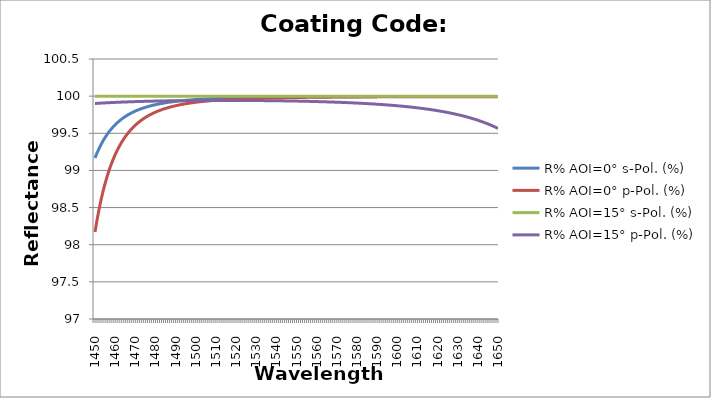
| Category | R% AOI=0° s-Pol. (%) | R% AOI=0° p-Pol. (%) | R% AOI=15° s-Pol. (%) | R% AOI=15° p-Pol. (%) |
|---|---|---|---|---|
| 1450.0 | 99.167 | 98.17 | 99.999 | 99.901 |
| 1451.0 | 99.234 | 98.332 | 99.999 | 99.903 |
| 1452.0 | 99.294 | 98.475 | 99.999 | 99.904 |
| 1453.0 | 99.349 | 98.604 | 99.999 | 99.906 |
| 1454.0 | 99.398 | 98.72 | 99.999 | 99.908 |
| 1455.0 | 99.443 | 98.824 | 99.999 | 99.909 |
| 1456.0 | 99.484 | 98.918 | 99.999 | 99.911 |
| 1457.0 | 99.521 | 99.003 | 99.999 | 99.912 |
| 1458.0 | 99.555 | 99.079 | 99.999 | 99.913 |
| 1459.0 | 99.586 | 99.149 | 99.999 | 99.915 |
| 1460.0 | 99.614 | 99.212 | 99.999 | 99.916 |
| 1461.0 | 99.64 | 99.27 | 99.999 | 99.917 |
| 1462.0 | 99.664 | 99.322 | 99.999 | 99.918 |
| 1463.0 | 99.686 | 99.37 | 99.999 | 99.92 |
| 1464.0 | 99.707 | 99.413 | 99.999 | 99.921 |
| 1465.0 | 99.725 | 99.453 | 99.999 | 99.922 |
| 1466.0 | 99.742 | 99.49 | 99.999 | 99.923 |
| 1467.0 | 99.758 | 99.523 | 99.999 | 99.924 |
| 1468.0 | 99.773 | 99.554 | 99.999 | 99.924 |
| 1469.0 | 99.786 | 99.583 | 99.999 | 99.925 |
| 1470.0 | 99.799 | 99.609 | 99.999 | 99.926 |
| 1471.0 | 99.811 | 99.633 | 99.999 | 99.927 |
| 1472.0 | 99.822 | 99.656 | 99.999 | 99.928 |
| 1473.0 | 99.832 | 99.676 | 99.999 | 99.929 |
| 1474.0 | 99.841 | 99.695 | 99.999 | 99.93 |
| 1475.0 | 99.85 | 99.713 | 99.999 | 99.93 |
| 1476.0 | 99.858 | 99.729 | 99.999 | 99.931 |
| 1477.0 | 99.865 | 99.745 | 99.999 | 99.932 |
| 1478.0 | 99.872 | 99.759 | 99.999 | 99.932 |
| 1479.0 | 99.879 | 99.772 | 99.999 | 99.933 |
| 1480.0 | 99.885 | 99.784 | 99.999 | 99.933 |
| 1481.0 | 99.891 | 99.796 | 99.999 | 99.934 |
| 1482.0 | 99.896 | 99.807 | 99.999 | 99.934 |
| 1483.0 | 99.901 | 99.817 | 99.999 | 99.935 |
| 1484.0 | 99.906 | 99.826 | 99.999 | 99.936 |
| 1485.0 | 99.911 | 99.835 | 99.999 | 99.936 |
| 1486.0 | 99.915 | 99.843 | 99.999 | 99.936 |
| 1487.0 | 99.919 | 99.851 | 99.999 | 99.937 |
| 1488.0 | 99.923 | 99.858 | 99.999 | 99.937 |
| 1489.0 | 99.926 | 99.865 | 99.999 | 99.938 |
| 1490.0 | 99.929 | 99.871 | 99.999 | 99.938 |
| 1491.0 | 99.932 | 99.877 | 99.999 | 99.938 |
| 1492.0 | 99.935 | 99.883 | 99.999 | 99.939 |
| 1493.0 | 99.938 | 99.888 | 99.999 | 99.939 |
| 1494.0 | 99.941 | 99.893 | 99.999 | 99.94 |
| 1495.0 | 99.943 | 99.898 | 99.999 | 99.94 |
| 1496.0 | 99.946 | 99.902 | 99.999 | 99.94 |
| 1497.0 | 99.948 | 99.906 | 99.999 | 99.94 |
| 1498.0 | 99.95 | 99.91 | 99.999 | 99.94 |
| 1499.0 | 99.952 | 99.914 | 99.999 | 99.941 |
| 1500.0 | 99.954 | 99.918 | 99.999 | 99.941 |
| 1501.0 | 99.956 | 99.921 | 99.999 | 99.941 |
| 1502.0 | 99.957 | 99.924 | 99.999 | 99.941 |
| 1503.0 | 99.959 | 99.927 | 99.999 | 99.942 |
| 1504.0 | 99.96 | 99.93 | 99.999 | 99.942 |
| 1505.0 | 99.962 | 99.932 | 99.999 | 99.942 |
| 1506.0 | 99.963 | 99.935 | 99.999 | 99.942 |
| 1507.0 | 99.965 | 99.938 | 99.999 | 99.942 |
| 1508.0 | 99.966 | 99.94 | 99.999 | 99.942 |
| 1509.0 | 99.967 | 99.942 | 99.999 | 99.942 |
| 1510.0 | 99.968 | 99.944 | 99.999 | 99.942 |
| 1511.0 | 99.969 | 99.946 | 99.999 | 99.942 |
| 1512.0 | 99.97 | 99.948 | 99.999 | 99.942 |
| 1513.0 | 99.971 | 99.95 | 99.999 | 99.942 |
| 1514.0 | 99.972 | 99.952 | 99.999 | 99.942 |
| 1515.0 | 99.973 | 99.953 | 99.999 | 99.942 |
| 1516.0 | 99.974 | 99.955 | 99.999 | 99.942 |
| 1517.0 | 99.975 | 99.956 | 99.999 | 99.942 |
| 1518.0 | 99.976 | 99.958 | 99.999 | 99.942 |
| 1519.0 | 99.976 | 99.959 | 99.999 | 99.942 |
| 1520.0 | 99.977 | 99.96 | 99.999 | 99.942 |
| 1521.0 | 99.978 | 99.962 | 99.999 | 99.942 |
| 1522.0 | 99.978 | 99.963 | 99.999 | 99.942 |
| 1523.0 | 99.979 | 99.964 | 99.999 | 99.942 |
| 1524.0 | 99.98 | 99.965 | 99.999 | 99.942 |
| 1525.0 | 99.98 | 99.966 | 99.999 | 99.942 |
| 1526.0 | 99.981 | 99.967 | 99.999 | 99.941 |
| 1527.0 | 99.981 | 99.968 | 99.999 | 99.941 |
| 1528.0 | 99.982 | 99.969 | 99.999 | 99.941 |
| 1529.0 | 99.982 | 99.97 | 99.999 | 99.941 |
| 1530.0 | 99.983 | 99.97 | 99.999 | 99.941 |
| 1531.0 | 99.983 | 99.971 | 99.999 | 99.94 |
| 1532.0 | 99.984 | 99.972 | 99.999 | 99.94 |
| 1533.0 | 99.984 | 99.973 | 99.999 | 99.94 |
| 1534.0 | 99.985 | 99.974 | 99.999 | 99.94 |
| 1535.0 | 99.985 | 99.974 | 99.999 | 99.939 |
| 1536.0 | 99.985 | 99.975 | 99.999 | 99.939 |
| 1537.0 | 99.986 | 99.976 | 99.999 | 99.939 |
| 1538.0 | 99.986 | 99.976 | 99.999 | 99.938 |
| 1539.0 | 99.986 | 99.977 | 99.999 | 99.938 |
| 1540.0 | 99.987 | 99.977 | 99.999 | 99.938 |
| 1541.0 | 99.987 | 99.978 | 99.999 | 99.937 |
| 1542.0 | 99.987 | 99.978 | 99.999 | 99.937 |
| 1543.0 | 99.988 | 99.979 | 99.999 | 99.937 |
| 1544.0 | 99.988 | 99.979 | 99.999 | 99.936 |
| 1545.0 | 99.988 | 99.98 | 99.999 | 99.936 |
| 1546.0 | 99.988 | 99.98 | 99.999 | 99.935 |
| 1547.0 | 99.989 | 99.981 | 99.999 | 99.935 |
| 1548.0 | 99.989 | 99.981 | 99.999 | 99.934 |
| 1549.0 | 99.989 | 99.982 | 99.999 | 99.934 |
| 1550.0 | 99.989 | 99.982 | 99.999 | 99.933 |
| 1551.0 | 99.99 | 99.982 | 99.999 | 99.933 |
| 1552.0 | 99.99 | 99.983 | 99.999 | 99.932 |
| 1553.0 | 99.99 | 99.983 | 99.999 | 99.932 |
| 1554.0 | 99.99 | 99.983 | 99.999 | 99.931 |
| 1555.0 | 99.99 | 99.984 | 99.999 | 99.93 |
| 1556.0 | 99.99 | 99.984 | 99.999 | 99.93 |
| 1557.0 | 99.991 | 99.984 | 99.999 | 99.929 |
| 1558.0 | 99.991 | 99.984 | 99.999 | 99.928 |
| 1559.0 | 99.991 | 99.985 | 99.999 | 99.928 |
| 1560.0 | 99.991 | 99.985 | 99.999 | 99.927 |
| 1561.0 | 99.991 | 99.985 | 99.999 | 99.926 |
| 1562.0 | 99.991 | 99.986 | 99.999 | 99.925 |
| 1563.0 | 99.992 | 99.986 | 99.999 | 99.924 |
| 1564.0 | 99.992 | 99.986 | 99.999 | 99.924 |
| 1565.0 | 99.992 | 99.986 | 99.999 | 99.923 |
| 1566.0 | 99.992 | 99.986 | 99.999 | 99.922 |
| 1567.0 | 99.992 | 99.987 | 99.999 | 99.921 |
| 1568.0 | 99.992 | 99.987 | 99.999 | 99.92 |
| 1569.0 | 99.992 | 99.987 | 99.999 | 99.919 |
| 1570.0 | 99.992 | 99.987 | 99.999 | 99.918 |
| 1571.0 | 99.992 | 99.988 | 99.999 | 99.917 |
| 1572.0 | 99.993 | 99.988 | 99.999 | 99.916 |
| 1573.0 | 99.993 | 99.988 | 99.999 | 99.915 |
| 1574.0 | 99.993 | 99.988 | 99.999 | 99.914 |
| 1575.0 | 99.993 | 99.988 | 99.999 | 99.913 |
| 1576.0 | 99.993 | 99.988 | 99.999 | 99.912 |
| 1577.0 | 99.993 | 99.988 | 99.999 | 99.91 |
| 1578.0 | 99.993 | 99.989 | 99.999 | 99.909 |
| 1579.0 | 99.993 | 99.989 | 99.999 | 99.908 |
| 1580.0 | 99.993 | 99.989 | 99.999 | 99.907 |
| 1581.0 | 99.993 | 99.989 | 99.999 | 99.905 |
| 1582.0 | 99.994 | 99.989 | 99.999 | 99.904 |
| 1583.0 | 99.994 | 99.989 | 99.999 | 99.902 |
| 1584.0 | 99.994 | 99.99 | 99.999 | 99.901 |
| 1585.0 | 99.994 | 99.99 | 99.999 | 99.9 |
| 1586.0 | 99.994 | 99.99 | 99.999 | 99.898 |
| 1587.0 | 99.994 | 99.99 | 99.999 | 99.896 |
| 1588.0 | 99.994 | 99.99 | 99.999 | 99.895 |
| 1589.0 | 99.994 | 99.99 | 99.999 | 99.893 |
| 1590.0 | 99.994 | 99.99 | 99.999 | 99.891 |
| 1591.0 | 99.994 | 99.99 | 99.999 | 99.889 |
| 1592.0 | 99.994 | 99.99 | 99.999 | 99.888 |
| 1593.0 | 99.994 | 99.99 | 99.999 | 99.886 |
| 1594.0 | 99.994 | 99.99 | 99.999 | 99.884 |
| 1595.0 | 99.994 | 99.991 | 99.999 | 99.882 |
| 1596.0 | 99.994 | 99.991 | 99.999 | 99.88 |
| 1597.0 | 99.994 | 99.991 | 99.999 | 99.877 |
| 1598.0 | 99.994 | 99.991 | 99.999 | 99.875 |
| 1599.0 | 99.994 | 99.991 | 99.999 | 99.873 |
| 1600.0 | 99.994 | 99.991 | 99.999 | 99.87 |
| 1601.0 | 99.995 | 99.991 | 99.999 | 99.868 |
| 1602.0 | 99.995 | 99.991 | 99.999 | 99.866 |
| 1603.0 | 99.995 | 99.991 | 99.999 | 99.863 |
| 1604.0 | 99.995 | 99.991 | 99.999 | 99.86 |
| 1605.0 | 99.995 | 99.991 | 99.999 | 99.858 |
| 1606.0 | 99.995 | 99.991 | 99.999 | 99.855 |
| 1607.0 | 99.995 | 99.991 | 99.999 | 99.852 |
| 1608.0 | 99.995 | 99.992 | 99.999 | 99.849 |
| 1609.0 | 99.995 | 99.992 | 99.998 | 99.846 |
| 1610.0 | 99.995 | 99.992 | 99.998 | 99.843 |
| 1611.0 | 99.995 | 99.992 | 99.998 | 99.839 |
| 1612.0 | 99.995 | 99.992 | 99.998 | 99.836 |
| 1613.0 | 99.995 | 99.992 | 99.998 | 99.832 |
| 1614.0 | 99.995 | 99.992 | 99.998 | 99.829 |
| 1615.0 | 99.995 | 99.992 | 99.998 | 99.825 |
| 1616.0 | 99.995 | 99.992 | 99.998 | 99.821 |
| 1617.0 | 99.995 | 99.992 | 99.998 | 99.817 |
| 1618.0 | 99.995 | 99.992 | 99.998 | 99.813 |
| 1619.0 | 99.995 | 99.992 | 99.998 | 99.809 |
| 1620.0 | 99.995 | 99.992 | 99.998 | 99.804 |
| 1621.0 | 99.995 | 99.992 | 99.998 | 99.8 |
| 1622.0 | 99.995 | 99.992 | 99.998 | 99.795 |
| 1623.0 | 99.995 | 99.992 | 99.998 | 99.79 |
| 1624.0 | 99.995 | 99.992 | 99.998 | 99.785 |
| 1625.0 | 99.995 | 99.992 | 99.998 | 99.78 |
| 1626.0 | 99.995 | 99.992 | 99.998 | 99.775 |
| 1627.0 | 99.995 | 99.992 | 99.998 | 99.769 |
| 1628.0 | 99.995 | 99.992 | 99.998 | 99.763 |
| 1629.0 | 99.995 | 99.992 | 99.998 | 99.757 |
| 1630.0 | 99.995 | 99.992 | 99.998 | 99.751 |
| 1631.0 | 99.995 | 99.992 | 99.998 | 99.745 |
| 1632.0 | 99.995 | 99.992 | 99.998 | 99.738 |
| 1633.0 | 99.995 | 99.992 | 99.998 | 99.731 |
| 1634.0 | 99.995 | 99.992 | 99.998 | 99.724 |
| 1635.0 | 99.995 | 99.992 | 99.998 | 99.717 |
| 1636.0 | 99.995 | 99.992 | 99.998 | 99.709 |
| 1637.0 | 99.995 | 99.992 | 99.998 | 99.701 |
| 1638.0 | 99.995 | 99.992 | 99.998 | 99.693 |
| 1639.0 | 99.995 | 99.992 | 99.998 | 99.684 |
| 1640.0 | 99.995 | 99.992 | 99.997 | 99.676 |
| 1641.0 | 99.995 | 99.992 | 99.997 | 99.666 |
| 1642.0 | 99.995 | 99.992 | 99.997 | 99.657 |
| 1643.0 | 99.995 | 99.992 | 99.997 | 99.647 |
| 1644.0 | 99.995 | 99.992 | 99.997 | 99.637 |
| 1645.0 | 99.995 | 99.992 | 99.997 | 99.626 |
| 1646.0 | 99.995 | 99.992 | 99.997 | 99.615 |
| 1647.0 | 99.995 | 99.992 | 99.997 | 99.603 |
| 1648.0 | 99.995 | 99.992 | 99.997 | 99.591 |
| 1649.0 | 99.995 | 99.992 | 99.997 | 99.579 |
| 1650.0 | 99.995 | 99.992 | 99.997 | 99.566 |